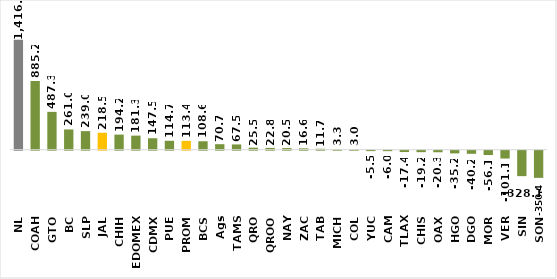
| Category | Series 0 |
|---|---|
| NL | 1416.723 |
| COAH | 885.187 |
| GTO | 487.322 |
| BC | 260.99 |
| SLP | 238.963 |
| JAL | 218.499 |
| CHIH | 194.234 |
| EDOMEX | 181.278 |
| CDMX | 147.459 |
| PUE | 114.656 |
| PROM | 113.424 |
| BCS | 108.579 |
| Ags | 70.726 |
| TAMS | 67.516 |
| QRO | 25.494 |
| QROO | 22.776 |
| NAY | 20.539 |
| ZAC | 16.582 |
| TAB | 11.736 |
| MICH | 3.264 |
| COL | 3.04 |
| YUC | -5.53 |
| CAM | -5.958 |
| TLAX | -17.439 |
| CHIS | -19.164 |
| OAX | -20.272 |
| HGO | -35.154 |
| DGO | -40.191 |
| MOR | -56.117 |
| VER | -101.089 |
| SIN | -328.128 |
| SON | -350.381 |